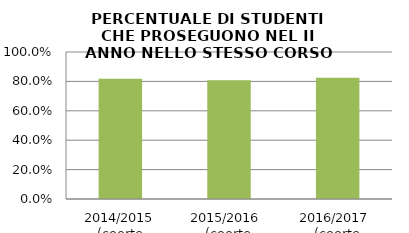
| Category | 2014/2015 (coorte 2013/14) 2015/2016  (coorte 2014/15) 2016/2017  (coorte 2015/16) |
|---|---|
| 2014/2015 (coorte 2013/14) | 0.818 |
| 2015/2016  (coorte 2014/15) | 0.808 |
| 2016/2017  (coorte 2015/16) | 0.825 |